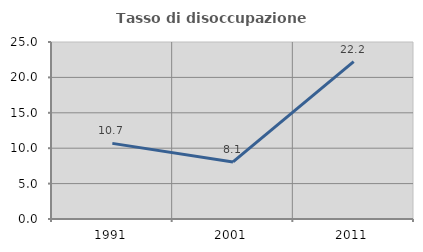
| Category | Tasso di disoccupazione giovanile  |
|---|---|
| 1991.0 | 10.68 |
| 2001.0 | 8.065 |
| 2011.0 | 22.222 |